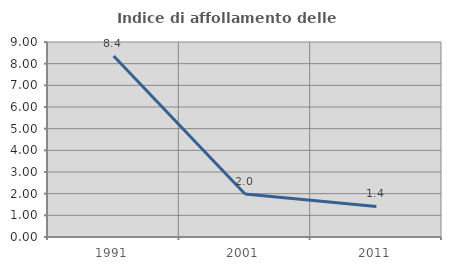
| Category | Indice di affollamento delle abitazioni  |
|---|---|
| 1991.0 | 8.354 |
| 2001.0 | 1.981 |
| 2011.0 | 1.412 |